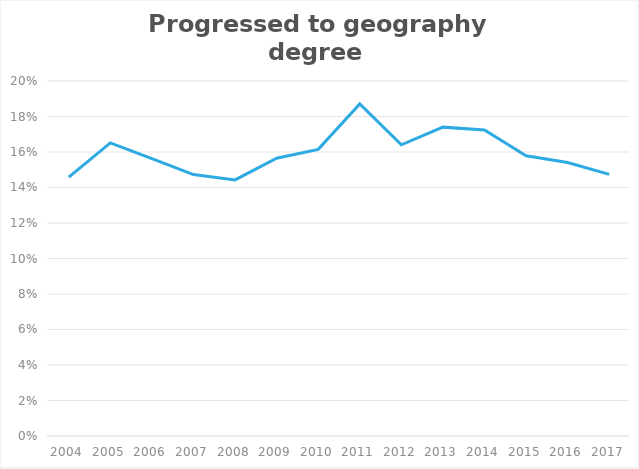
| Category | Percent progressing to geography degree |
|---|---|
| 2004.0 | 0.146 |
| 2005.0 | 0.165 |
| 2006.0 | 0.156 |
| 2007.0 | 0.147 |
| 2008.0 | 0.144 |
| 2009.0 | 0.157 |
| 2010.0 | 0.161 |
| 2011.0 | 0.187 |
| 2012.0 | 0.164 |
| 2013.0 | 0.174 |
| 2014.0 | 0.172 |
| 2015.0 | 0.158 |
| 2016.0 | 0.154 |
| 2017.0 | 0.147 |